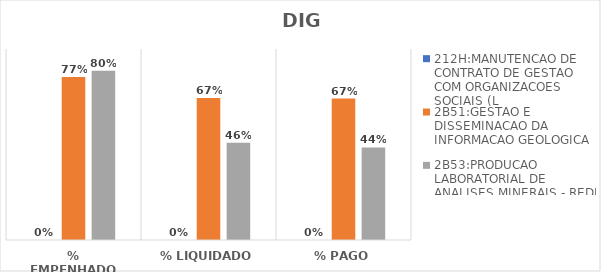
| Category | 212H:MANUTENCAO DE CONTRATO DE GESTAO COM ORGANIZACOES SOCIAIS (L | 2B51:GESTAO E DISSEMINACAO DA INFORMACAO GEOLOGICA | 2B53:PRODUCAO LABORATORIAL DE ANALISES MINERAIS - REDE LAMIN |
|---|---|---|---|
| % EMPENHADO | 0 | 0.768 | 0.798 |
| % LIQUIDADO | 0 | 0.669 | 0.459 |
| % PAGO | 0 | 0.666 | 0.436 |